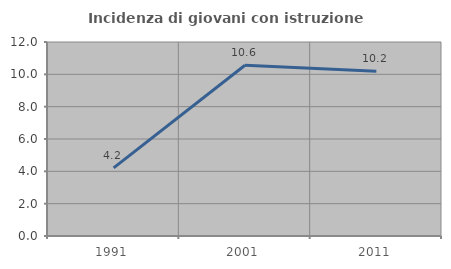
| Category | Incidenza di giovani con istruzione universitaria |
|---|---|
| 1991.0 | 4.217 |
| 2001.0 | 10.563 |
| 2011.0 | 10.185 |